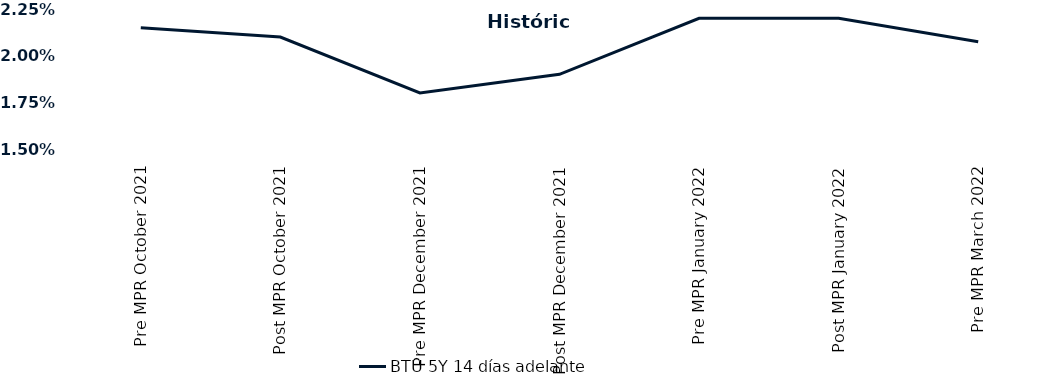
| Category | BTU 5Y 14 días adelante |
|---|---|
| Pre MPR October 2021 | 0.022 |
| Post MPR October 2021 | 0.021 |
| Pre MPR December 2021 | 0.018 |
| Post MPR December 2021 | 0.019 |
| Pre MPR January 2022 | 0.022 |
| Post MPR January 2022 | 0.022 |
| Pre MPR March 2022 | 0.021 |